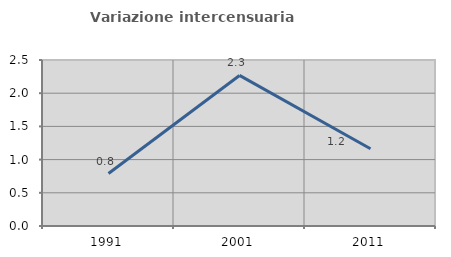
| Category | Variazione intercensuaria annua |
|---|---|
| 1991.0 | 0.79 |
| 2001.0 | 2.268 |
| 2011.0 | 1.163 |